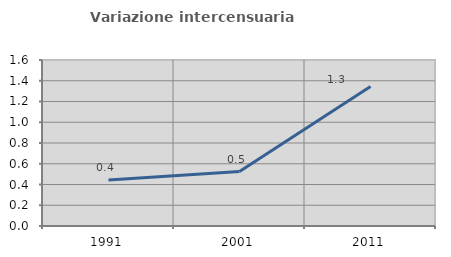
| Category | Variazione intercensuaria annua |
|---|---|
| 1991.0 | 0.444 |
| 2001.0 | 0.524 |
| 2011.0 | 1.345 |